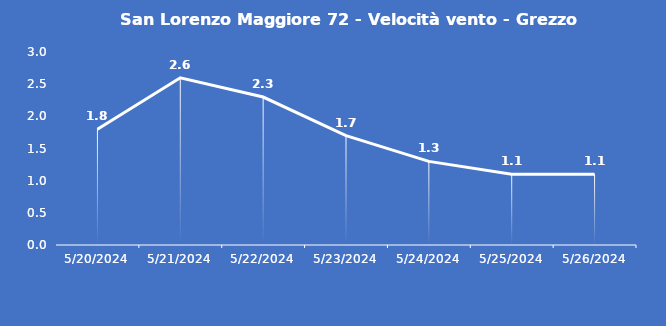
| Category | San Lorenzo Maggiore 72 - Velocità vento - Grezzo (m/s) |
|---|---|
| 5/20/24 | 1.8 |
| 5/21/24 | 2.6 |
| 5/22/24 | 2.3 |
| 5/23/24 | 1.7 |
| 5/24/24 | 1.3 |
| 5/25/24 | 1.1 |
| 5/26/24 | 1.1 |